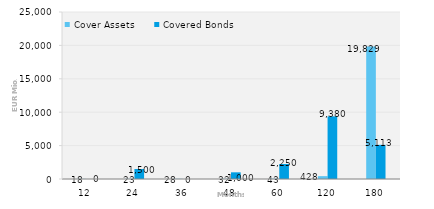
| Category | Cover Assets | Covered Bonds |
|---|---|---|
| 12.0 | 18.391 | 0 |
| 24.0 | 22.591 | 1500 |
| 36.0 | 27.521 | 0 |
| 48.0 | 31.557 | 1000 |
| 60.0 | 43.087 | 2250 |
| 120.0 | 427.556 | 9380 |
| 180.0 | 19829.297 | 5113 |